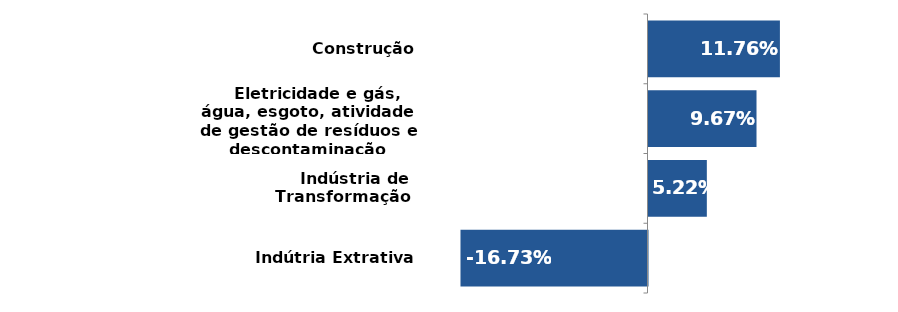
| Category | Series 0 |
|---|---|
|    Indútria Extrativa | -0.167 |
|    Indústria de Transformação  | 0.052 |
|    Eletricidade e gás, água, esgoto, atividade de gestão de resíduos e descontaminação | 0.097 |
|    Construção | 0.118 |